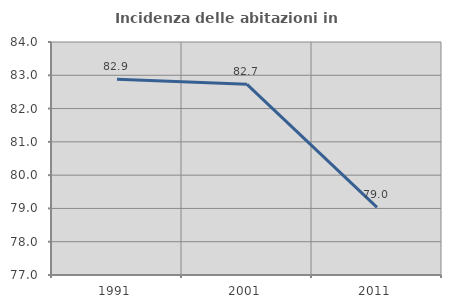
| Category | Incidenza delle abitazioni in proprietà  |
|---|---|
| 1991.0 | 82.878 |
| 2001.0 | 82.729 |
| 2011.0 | 79.03 |